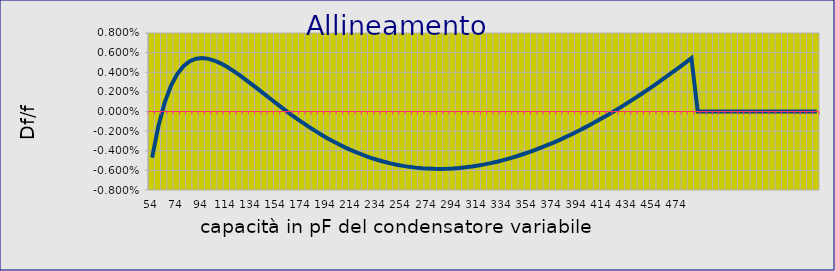
| Category | Series 0 |
|---|---|
| 54 | -0.005 |
| 59 | -0.001 |
| 64 | 0.001 |
| 69 | 0.003 |
| 74 | 0.004 |
| 79 | 0.005 |
| 84 | 0.005 |
| 89 | 0.005 |
| 94 | 0.005 |
| 99 | 0.005 |
| 104 | 0.005 |
| 109 | 0.005 |
| 114 | 0.005 |
| 119 | 0.004 |
| 124 | 0.004 |
| 129 | 0.003 |
| 134 | 0.003 |
| 139 | 0.002 |
| 144 | 0.002 |
| 149 | 0.001 |
| 154 | 0.001 |
| 159 | 0 |
| 164 | 0 |
| 169 | -0.001 |
| 174 | -0.001 |
| 179 | -0.002 |
| 184 | -0.002 |
| 189 | -0.002 |
| 194 | -0.003 |
| 199 | -0.003 |
| 204 | -0.003 |
| 209 | -0.004 |
| 214 | -0.004 |
| 219 | -0.004 |
| 224 | -0.005 |
| 229 | -0.005 |
| 234 | -0.005 |
| 239 | -0.005 |
| 244 | -0.005 |
| 249 | -0.005 |
| 254 | -0.006 |
| 259 | -0.006 |
| 264 | -0.006 |
| 269 | -0.006 |
| 274 | -0.006 |
| 279 | -0.006 |
| 284 | -0.006 |
| 289 | -0.006 |
| 294 | -0.006 |
| 299 | -0.006 |
| 304 | -0.006 |
| 309 | -0.006 |
| 314 | -0.006 |
| 319 | -0.005 |
| 324 | -0.005 |
| 329 | -0.005 |
| 334 | -0.005 |
| 339 | -0.005 |
| 344 | -0.005 |
| 349 | -0.004 |
| 354 | -0.004 |
| 359 | -0.004 |
| 364 | -0.004 |
| 369 | -0.003 |
| 374 | -0.003 |
| 379 | -0.003 |
| 384 | -0.003 |
| 389 | -0.002 |
| 394 | -0.002 |
| 399 | -0.002 |
| 404 | -0.001 |
| 409 | -0.001 |
| 414 | -0.001 |
| 419 | 0 |
| 424 | 0 |
| 429 | 0.001 |
| 434 | 0.001 |
| 439 | 0.001 |
| 444 | 0.002 |
| 449 | 0.002 |
| 454 | 0.003 |
| 459 | 0.003 |
| 464 | 0.004 |
| 469 | 0.004 |
| 474 | 0.004 |
| 479 | 0.005 |
| 484 | 0.005 |
| 489 | 0 |